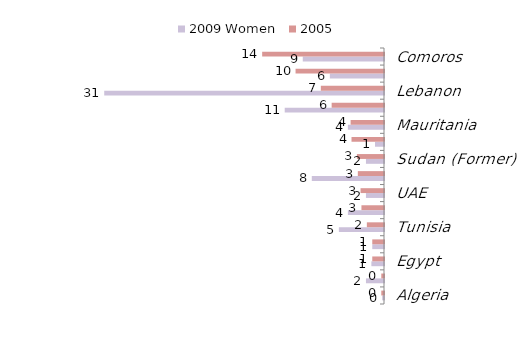
| Category | 2009 Women | 2005 |
|---|---|---|
| Algeria | -0.2 | -0.3 |
| Morocco | -2 | -0.3 |
| Egypt | -1.4 | -1.3 |
| Oman | -1.3 | -1.3 |
| Tunisia | -5 | -1.9 |
| Iraq | -4 | -2.5 |
| UAE | -2 | -2.6 |
| Bahrain | -8 | -2.9 |
| Sudan (Former) | -2 | -3 |
| Saudi Arabia | -1 | -3.6 |
| Mauritania | -4 | -3.7 |
| Yemen | -11 | -5.8 |
| Lebanon | -31 | -7 |
| Jordan | -6 | -9.8 |
| Comoros | -9 | -13.5 |